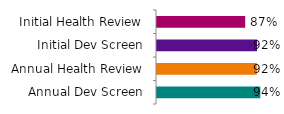
| Category | Series 0 |
|---|---|
| Annual Dev Screen | 0.938 |
| Annual Health Review | 0.923 |
| Initial Dev Screen | 0.924 |
| Initial Health Review | 0.874 |